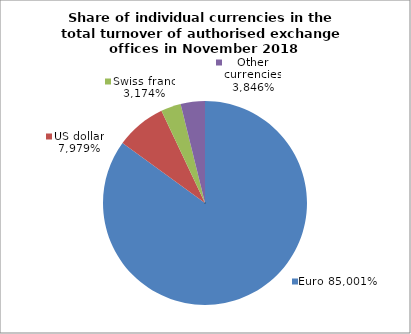
| Category | EUR |
|---|---|
| 0 | 0.85 |
| 1 | 0.08 |
| 2 | 0.032 |
| 3 | 0.038 |